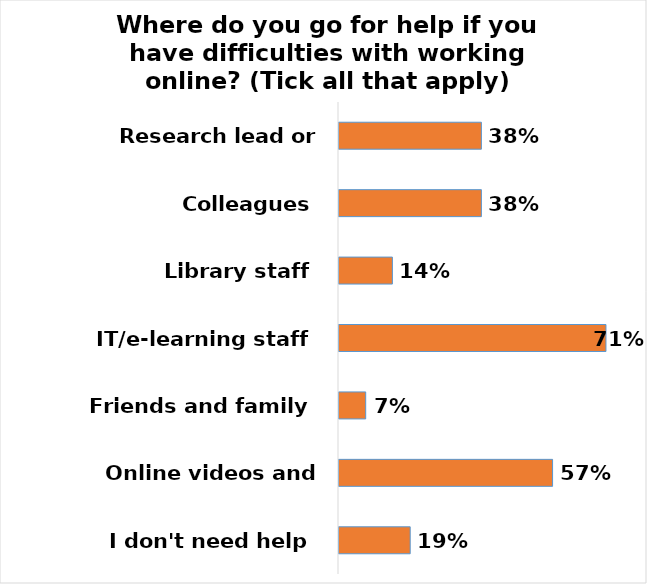
| Category | Series 0 |
|---|---|
| Research lead or supervisor | 0.381 |
| Colleagues | 0.381 |
| Library staff | 0.143 |
| IT/e-learning staff | 0.714 |
| Friends and family | 0.071 |
| Online videos and resources | 0.571 |
| I don't need help | 0.19 |